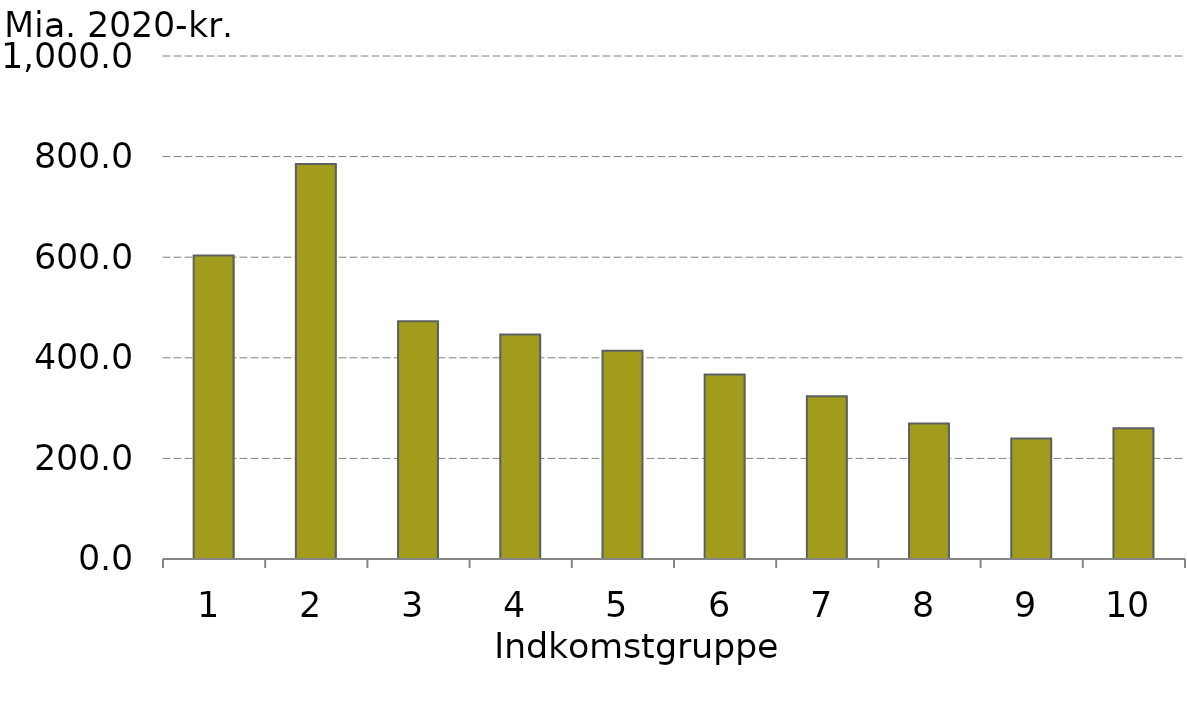
| Category |  Ældre lejeboliger |
|---|---|
| 0 | 603.28 |
| 1 | 785.296 |
| 2 | 472.731 |
| 3 | 446.537 |
| 4 | 413.971 |
| 5 | 366.96 |
| 6 | 323.749 |
| 7 | 269.404 |
| 8 | 239.533 |
| 9 | 260.065 |